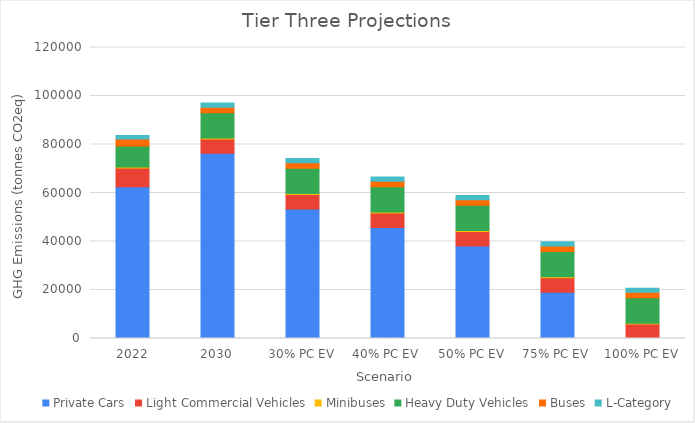
| Category | Private Cars | Light Commercial Vehicles | Minibuses | Heavy Duty Vehicles | Buses | L-Category |
|---|---|---|---|---|---|---|
| 2022 | 62569.964 | 7717.314 | 469.616 | 8663.159 | 2800.963 | 1458.218 |
| 2030 | 76351.832 | 5960.184 | 368.078 | 10442.322 | 2264.621 | 1729.035 |
| 30% PC EV | 53446.282 | 5960.184 | 368.078 | 10442.322 | 2264.621 | 1729.035 |
| 40% PC EV | 45811.099 | 5960.184 | 368.078 | 10442.322 | 2264.621 | 1729.035 |
| 50% PC EV | 38175.916 | 5960.184 | 368.078 | 10442.322 | 2264.621 | 1729.035 |
| 75% PC EV | 19087.958 | 5960.184 | 368.078 | 10442.322 | 2264.621 | 1729.035 |
| 100% PC EV | 0 | 5960.184 | 368.078 | 10442.322 | 2264.621 | 1729.035 |